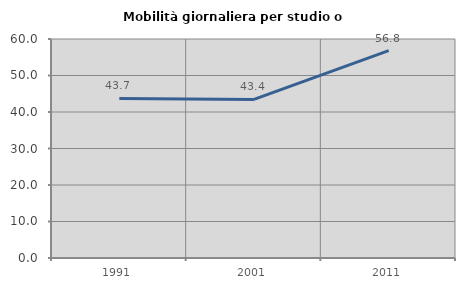
| Category | Mobilità giornaliera per studio o lavoro |
|---|---|
| 1991.0 | 43.712 |
| 2001.0 | 43.447 |
| 2011.0 | 56.791 |